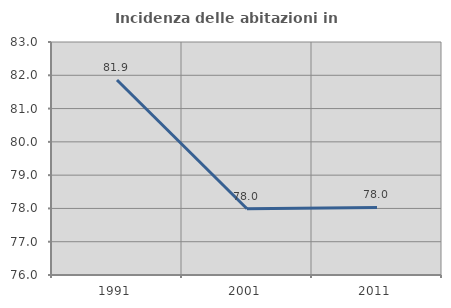
| Category | Incidenza delle abitazioni in proprietà  |
|---|---|
| 1991.0 | 81.859 |
| 2001.0 | 77.989 |
| 2011.0 | 78.03 |